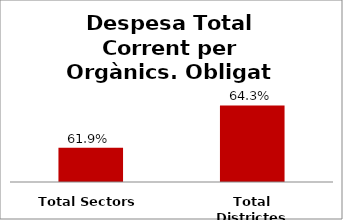
| Category | Series 0 |
|---|---|
| Total Sectors | 0.619 |
| Total Districtes | 0.643 |